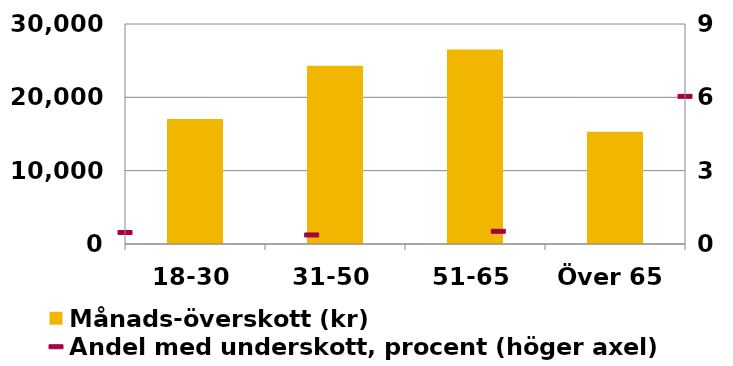
| Category | Månads-överskott (kr) |
|---|---|
| 18-30 | 17041.13 |
| 31-50 | 24298.67 |
| 51-65 | 26539.5 |
| Över 65 | 15297.67 |